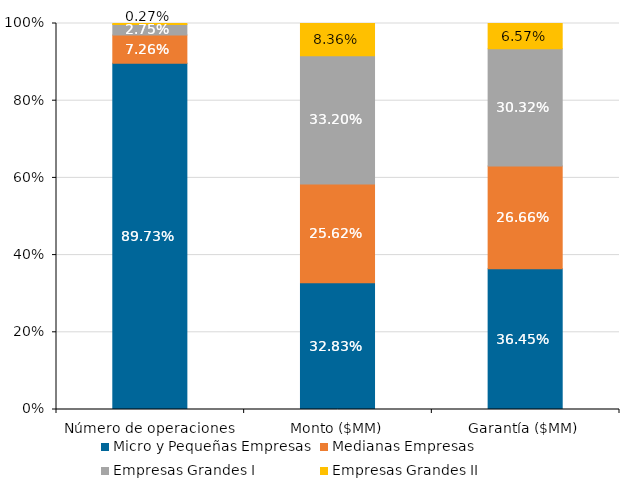
| Category | Micro y Pequeñas Empresas | Medianas Empresas | Empresas Grandes I | Empresas Grandes II |
|---|---|---|---|---|
| Número de operaciones | 0.897 | 0.073 | 0.027 | 0.003 |
| Monto ($MM) | 0.328 | 0.256 | 0.332 | 0.084 |
| Garantía ($MM) | 0.364 | 0.267 | 0.303 | 0.066 |